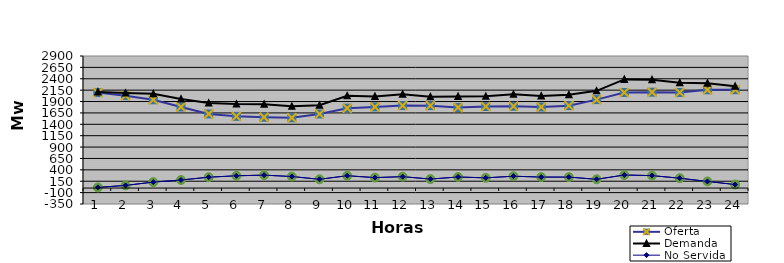
| Category | Oferta | No Servida | Demanda |
|---|---|---|---|
| 1.0 | 2095.7 | 14.337 | 2110.037 |
| 2.0 | 2028.38 | 58.267 | 2086.647 |
| 3.0 | 1937.87 | 131.038 | 2068.908 |
| 4.0 | 1780.18 | 176.766 | 1956.946 |
| 5.0 | 1628.1 | 238.623 | 1866.723 |
| 6.0 | 1574.33 | 269.79 | 1844.12 |
| 7.0 | 1555.66 | 284.003 | 1839.663 |
| 8.0 | 1543.01 | 253.333 | 1796.343 |
| 9.0 | 1627.14 | 192.789 | 1819.929 |
| 10.0 | 1754.74 | 270.835 | 2025.575 |
| 11.0 | 1782.04 | 229.657 | 2011.697 |
| 12.0 | 1811.04 | 250.196 | 2061.236 |
| 13.0 | 1808.93 | 197.809 | 2006.739 |
| 14.0 | 1769.86 | 243.094 | 2012.954 |
| 15.0 | 1790.12 | 224.273 | 2014.393 |
| 16.0 | 1797.19 | 260.248 | 2057.438 |
| 17.0 | 1780.47 | 241.426 | 2021.896 |
| 18.0 | 1809.88 | 240.8 | 2050.68 |
| 19.0 | 1942.3 | 192.663 | 2134.963 |
| 20.0 | 2098.29 | 286.802 | 2385.092 |
| 21.0 | 2105.39 | 273.144 | 2378.534 |
| 22.0 | 2097.92 | 216.681 | 2314.601 |
| 23.0 | 2157.06 | 145.207 | 2302.267 |
| 24.0 | 2159.87 | 77.25 | 2237.12 |